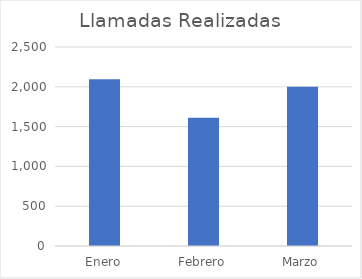
| Category | Llamadas Realizadas |
|---|---|
| Enero | 2095 |
| Febrero | 1612 |
| Marzo | 2002 |